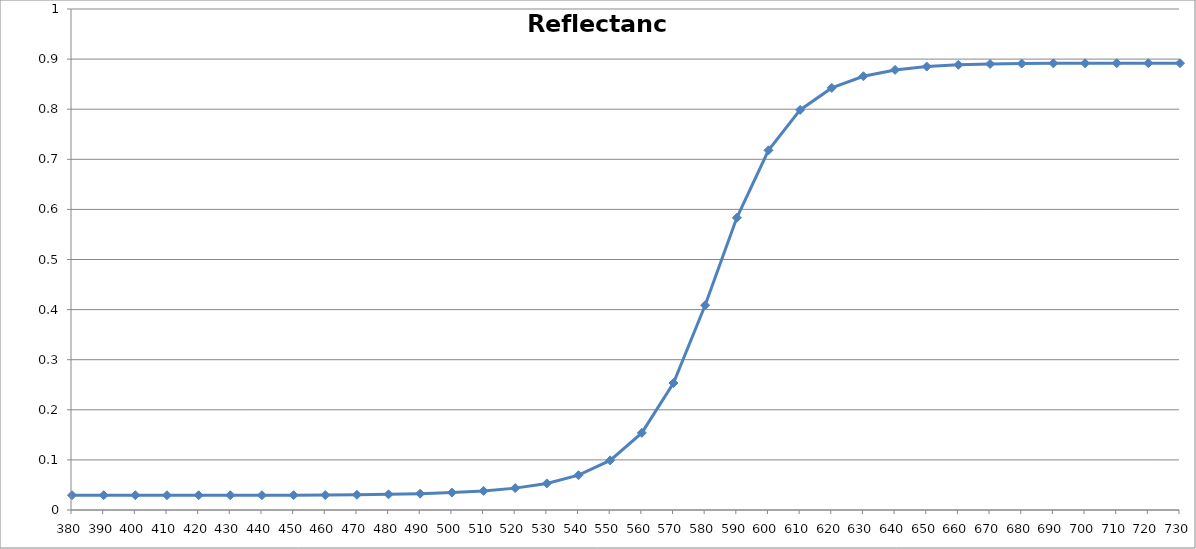
| Category | Series 0 |
|---|---|
| 380.0 | 0.029 |
| 390.0 | 0.029 |
| 400.0 | 0.029 |
| 410.0 | 0.029 |
| 420.0 | 0.029 |
| 430.0 | 0.029 |
| 440.0 | 0.029 |
| 450.0 | 0.03 |
| 460.0 | 0.03 |
| 470.0 | 0.03 |
| 480.0 | 0.031 |
| 490.0 | 0.033 |
| 500.0 | 0.035 |
| 510.0 | 0.038 |
| 520.0 | 0.044 |
| 530.0 | 0.053 |
| 540.0 | 0.069 |
| 550.0 | 0.099 |
| 560.0 | 0.154 |
| 570.0 | 0.253 |
| 580.0 | 0.409 |
| 590.0 | 0.583 |
| 600.0 | 0.718 |
| 610.0 | 0.799 |
| 620.0 | 0.842 |
| 630.0 | 0.866 |
| 640.0 | 0.878 |
| 650.0 | 0.885 |
| 660.0 | 0.889 |
| 670.0 | 0.89 |
| 680.0 | 0.891 |
| 690.0 | 0.891 |
| 700.0 | 0.892 |
| 710.0 | 0.892 |
| 720.0 | 0.892 |
| 730.0 | 0.892 |